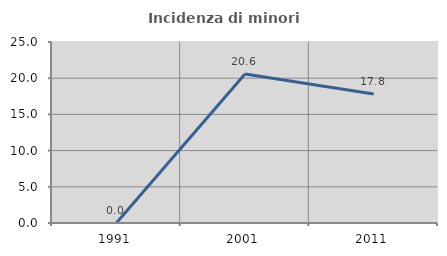
| Category | Incidenza di minori stranieri |
|---|---|
| 1991.0 | 0 |
| 2001.0 | 20.588 |
| 2011.0 | 17.829 |